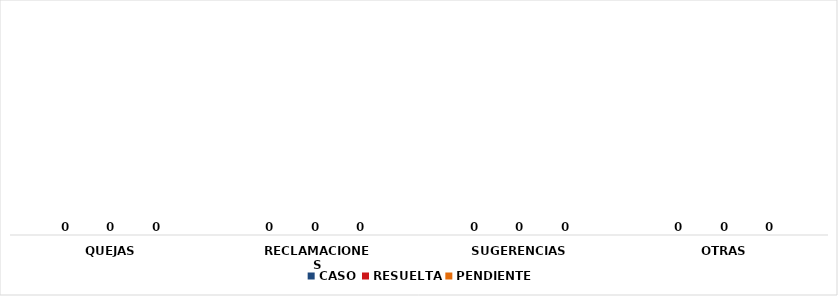
| Category | CASO | RESUELTA | PENDIENTE |
|---|---|---|---|
| QUEJAS | 0 | 0 | 0 |
| RECLAMACIONES | 0 | 0 | 0 |
| SUGERENCIAS | 0 | 0 | 0 |
| OTRAS | 0 | 0 | 0 |